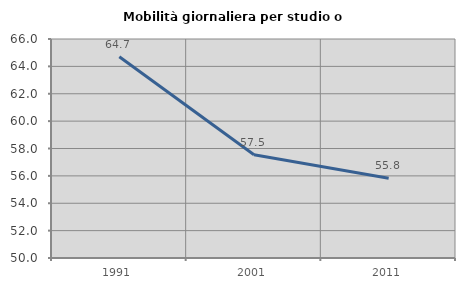
| Category | Mobilità giornaliera per studio o lavoro |
|---|---|
| 1991.0 | 64.702 |
| 2001.0 | 57.542 |
| 2011.0 | 55.823 |